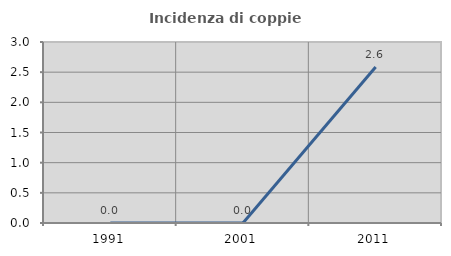
| Category | Incidenza di coppie miste |
|---|---|
| 1991.0 | 0 |
| 2001.0 | 0 |
| 2011.0 | 2.586 |